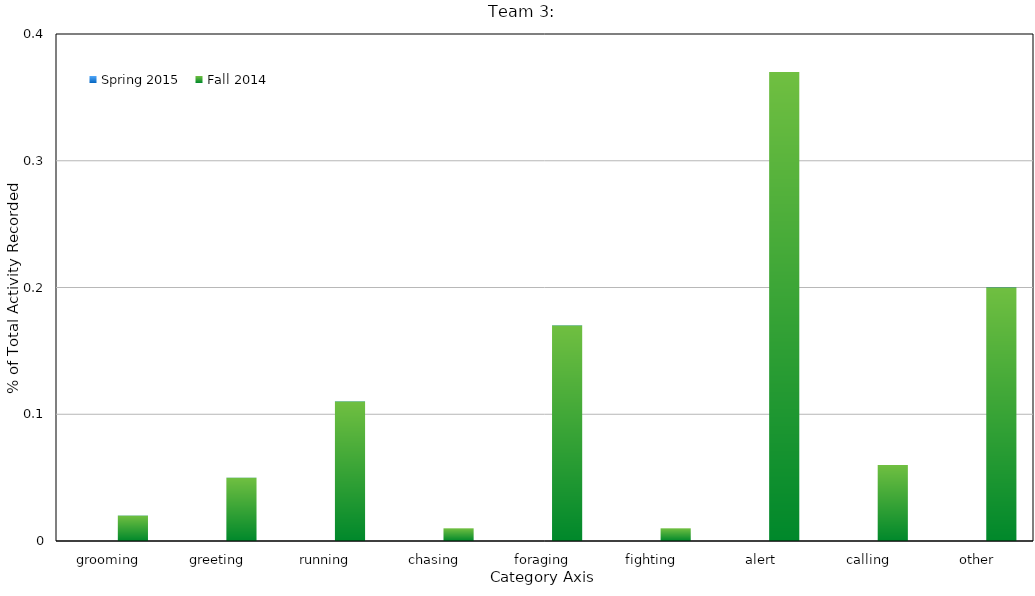
| Category | Spring 2015 | Fall 2014 |
|---|---|---|
| grooming |  | 0.02 |
| greeting |  | 0.05 |
| running |  | 0.11 |
| chasing |  | 0.01 |
| foraging |  | 0.17 |
| fighting |  | 0.01 |
| alert |  | 0.37 |
| calling |  | 0.06 |
| other |  | 0.2 |